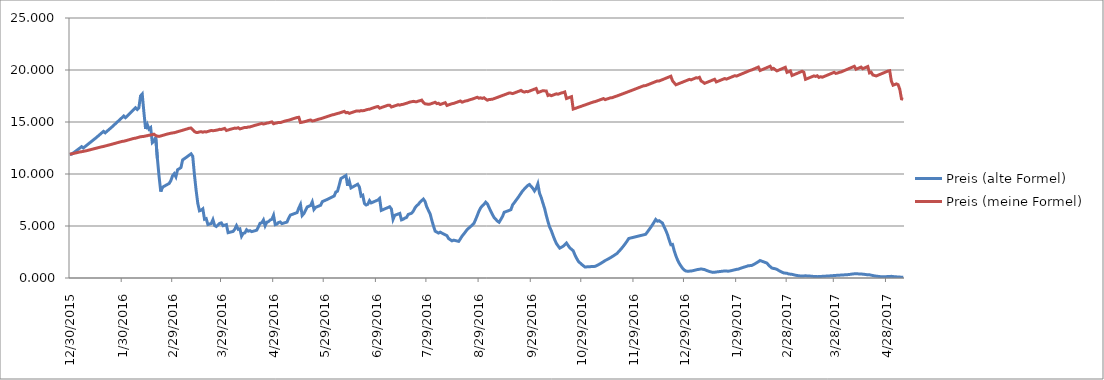
| Category | Preis (alte Formel) | Preis (meine Formel) |
|---|---|---|
| 12/30/15 | 11.9 | 11.9 |
| 12/31/15 | 11.9 | 11.941 |
| 1/1/16 | 12.02 | 11.966 |
| 1/2/16 | 12.14 | 12.006 |
| 1/3/16 | 12.26 | 12.045 |
| 1/4/16 | 12.38 | 12.086 |
| 1/5/16 | 12.5 | 12.122 |
| 1/6/16 | 12.63 | 12.145 |
| 1/7/16 | 12.5 | 12.176 |
| 1/8/16 | 12.63 | 12.211 |
| 1/9/16 | 12.76 | 12.243 |
| 1/10/16 | 12.89 | 12.285 |
| 1/11/16 | 13.02 | 12.327 |
| 1/12/16 | 13.15 | 12.37 |
| 1/13/16 | 13.28 | 12.412 |
| 1/14/16 | 13.41 | 12.455 |
| 1/15/16 | 13.54 | 12.495 |
| 1/16/16 | 13.68 | 12.538 |
| 1/17/16 | 13.82 | 12.581 |
| 1/18/16 | 13.96 | 12.615 |
| 1/19/16 | 14.1 | 12.648 |
| 1/20/16 | 13.96 | 12.692 |
| 1/21/16 | 14.1 | 12.735 |
| 1/22/16 | 14.24 | 12.777 |
| 1/23/16 | 14.38 | 12.821 |
| 1/24/16 | 14.52 | 12.865 |
| 1/25/16 | 14.67 | 12.909 |
| 1/26/16 | 14.82 | 12.954 |
| 1/27/16 | 14.97 | 12.998 |
| 1/28/16 | 15.12 | 13.043 |
| 1/29/16 | 15.27 | 13.088 |
| 1/30/16 | 15.42 | 13.133 |
| 1/31/16 | 15.57 | 13.151 |
| 2/1/16 | 15.41 | 13.193 |
| 2/2/16 | 15.56 | 13.239 |
| 2/3/16 | 15.72 | 13.285 |
| 2/4/16 | 15.88 | 13.33 |
| 2/5/16 | 16.04 | 13.376 |
| 2/6/16 | 16.2 | 13.422 |
| 2/7/16 | 16.36 | 13.444 |
| 2/8/16 | 16.2 | 13.49 |
| 2/9/16 | 16.36 | 13.536 |
| 2/10/16 | 17.51 | 13.583 |
| 2/11/16 | 17.69 | 13.6 |
| 2/12/16 | 15.92 | 13.617 |
| 2/13/16 | 14.33 | 13.656 |
| 2/14/16 | 14.76 | 13.683 |
| 2/15/16 | 14.32 | 13.73 |
| 2/16/16 | 14.46 | 13.743 |
| 2/17/16 | 13.01 | 13.79 |
| 2/18/16 | 13.14 | 13.827 |
| 2/19/16 | 13.53 | 13.696 |
| 2/20/16 | 11.5 | 13.642 |
| 2/21/16 | 9.78 | 13.616 |
| 2/22/16 | 8.31 | 13.658 |
| 2/23/16 | 8.73 | 13.705 |
| 2/24/16 | 8.82 | 13.752 |
| 2/25/16 | 8.91 | 13.8 |
| 2/26/16 | 9 | 13.847 |
| 2/27/16 | 9.09 | 13.884 |
| 2/28/16 | 9.36 | 13.922 |
| 2/29/16 | 9.83 | 13.951 |
| 3/1/16 | 10.03 | 13.969 |
| 3/2/16 | 9.73 | 14.017 |
| 3/3/16 | 10.41 | 14.065 |
| 3/4/16 | 10.51 | 14.114 |
| 3/5/16 | 10.62 | 14.157 |
| 3/6/16 | 11.36 | 14.206 |
| 3/7/16 | 11.47 | 14.255 |
| 3/8/16 | 11.58 | 14.304 |
| 3/9/16 | 11.7 | 14.354 |
| 3/10/16 | 11.82 | 14.403 |
| 3/11/16 | 11.94 | 14.422 |
| 3/12/16 | 11.7 | 14.256 |
| 3/13/16 | 9.94 | 14.081 |
| 3/14/16 | 8.45 | 14.002 |
| 3/15/16 | 7.18 | 13.997 |
| 3/16/16 | 6.46 | 14.045 |
| 3/17/16 | 6.52 | 14.068 |
| 3/18/16 | 6.65 | 14.019 |
| 3/19/16 | 5.65 | 14.068 |
| 3/20/16 | 5.71 | 14.043 |
| 3/21/16 | 5.14 | 14.091 |
| 3/22/16 | 5.19 | 14.14 |
| 3/23/16 | 5.24 | 14.186 |
| 3/24/16 | 5.61 | 14.162 |
| 3/25/16 | 5.05 | 14.179 |
| 3/26/16 | 4.95 | 14.211 |
| 3/27/16 | 5.1 | 14.244 |
| 3/28/16 | 5.25 | 14.293 |
| 3/29/16 | 5.3 | 14.286 |
| 3/30/16 | 5.03 | 14.335 |
| 3/31/16 | 5.08 | 14.384 |
| 4/1/16 | 5.13 | 14.183 |
| 4/2/16 | 4.36 | 14.232 |
| 4/3/16 | 4.4 | 14.281 |
| 4/4/16 | 4.44 | 14.331 |
| 4/5/16 | 4.48 | 14.367 |
| 4/6/16 | 4.7 | 14.413 |
| 4/7/16 | 5.03 | 14.4 |
| 4/8/16 | 4.68 | 14.45 |
| 4/9/16 | 4.73 | 14.338 |
| 4/10/16 | 4.02 | 14.384 |
| 4/11/16 | 4.3 | 14.433 |
| 4/12/16 | 4.34 | 14.48 |
| 4/13/16 | 4.64 | 14.474 |
| 4/14/16 | 4.5 | 14.524 |
| 4/15/16 | 4.55 | 14.53 |
| 4/16/16 | 4.46 | 14.58 |
| 4/17/16 | 4.5 | 14.63 |
| 4/18/16 | 4.55 | 14.68 |
| 4/19/16 | 4.6 | 14.723 |
| 4/20/16 | 4.92 | 14.769 |
| 4/21/16 | 5.26 | 14.82 |
| 4/22/16 | 5.31 | 14.858 |
| 4/23/16 | 5.58 | 14.803 |
| 4/24/16 | 5.02 | 14.843 |
| 4/25/16 | 5.37 | 14.894 |
| 4/26/16 | 5.42 | 14.916 |
| 4/27/16 | 5.58 | 14.967 |
| 4/28/16 | 5.64 | 15.01 |
| 4/29/16 | 6.03 | 14.833 |
| 4/30/16 | 5.13 | 14.884 |
| 5/1/16 | 5.18 | 14.91 |
| 5/2/16 | 5.34 | 14.961 |
| 5/3/16 | 5.39 | 14.943 |
| 5/4/16 | 5.23 | 14.995 |
| 5/5/16 | 5.28 | 15.047 |
| 5/6/16 | 5.33 | 15.099 |
| 5/7/16 | 5.38 | 15.138 |
| 5/8/16 | 5.76 | 15.172 |
| 5/9/16 | 6.05 | 15.224 |
| 5/10/16 | 6.11 | 15.276 |
| 5/11/16 | 6.17 | 15.329 |
| 5/12/16 | 6.23 | 15.382 |
| 5/13/16 | 6.29 | 15.428 |
| 5/14/16 | 6.73 | 15.453 |
| 5/15/16 | 7.07 | 14.95 |
| 5/16/16 | 6.01 | 14.977 |
| 5/17/16 | 6.19 | 15.016 |
| 5/18/16 | 6.5 | 15.053 |
| 5/19/16 | 6.83 | 15.105 |
| 5/20/16 | 6.9 | 15.157 |
| 5/21/16 | 6.97 | 15.195 |
| 5/22/16 | 7.32 | 15.1 |
| 5/23/16 | 6.59 | 15.123 |
| 5/24/16 | 6.79 | 15.175 |
| 5/25/16 | 6.86 | 15.228 |
| 5/26/16 | 6.93 | 15.28 |
| 5/27/16 | 7 | 15.316 |
| 5/28/16 | 7.35 | 15.369 |
| 5/29/16 | 7.42 | 15.422 |
| 5/30/16 | 7.49 | 15.475 |
| 5/31/16 | 7.56 | 15.529 |
| 6/1/16 | 7.64 | 15.582 |
| 6/2/16 | 7.72 | 15.636 |
| 6/3/16 | 7.8 | 15.69 |
| 6/4/16 | 7.88 | 15.719 |
| 6/5/16 | 8.27 | 15.773 |
| 6/6/16 | 8.35 | 15.822 |
| 6/7/16 | 8.93 | 15.858 |
| 6/8/16 | 9.56 | 15.913 |
| 6/9/16 | 9.66 | 15.967 |
| 6/10/16 | 9.76 | 16.022 |
| 6/11/16 | 9.86 | 15.89 |
| 6/12/16 | 8.87 | 15.922 |
| 6/13/16 | 9.31 | 15.83 |
| 6/14/16 | 8.66 | 15.885 |
| 6/15/16 | 8.75 | 15.939 |
| 6/16/16 | 8.84 | 15.994 |
| 6/17/16 | 8.93 | 16.05 |
| 6/18/16 | 9.02 | 16.064 |
| 6/19/16 | 8.75 | 16.041 |
| 6/20/16 | 7.88 | 16.097 |
| 6/21/16 | 7.96 | 16.085 |
| 6/22/16 | 7.16 | 16.111 |
| 6/23/16 | 7.02 | 16.167 |
| 6/24/16 | 7.09 | 16.212 |
| 6/25/16 | 7.44 | 16.232 |
| 6/26/16 | 7.22 | 16.288 |
| 6/27/16 | 7.29 | 16.344 |
| 6/28/16 | 7.36 | 16.401 |
| 6/29/16 | 7.43 | 16.457 |
| 6/30/16 | 7.5 | 16.488 |
| 7/1/16 | 7.65 | 16.331 |
| 7/2/16 | 6.5 | 16.387 |
| 7/3/16 | 6.57 | 16.444 |
| 7/4/16 | 6.64 | 16.5 |
| 7/5/16 | 6.71 | 16.557 |
| 7/6/16 | 6.78 | 16.614 |
| 7/7/16 | 6.85 | 16.615 |
| 7/8/16 | 6.64 | 16.443 |
| 7/9/16 | 5.64 | 16.492 |
| 7/10/16 | 6.03 | 16.549 |
| 7/11/16 | 6.09 | 16.606 |
| 7/12/16 | 6.15 | 16.663 |
| 7/13/16 | 6.21 | 16.62 |
| 7/14/16 | 5.59 | 16.678 |
| 7/15/16 | 5.65 | 16.7 |
| 7/16/16 | 5.76 | 16.757 |
| 7/17/16 | 5.82 | 16.8 |
| 7/18/16 | 6.11 | 16.858 |
| 7/19/16 | 6.17 | 16.916 |
| 7/20/16 | 6.23 | 16.945 |
| 7/21/16 | 6.42 | 16.986 |
| 7/22/16 | 6.74 | 16.958 |
| 7/23/16 | 6.94 | 16.949 |
| 7/24/16 | 7.08 | 17.008 |
| 7/25/16 | 7.29 | 17.048 |
| 7/26/16 | 7.44 | 17.107 |
| 7/27/16 | 7.59 | 16.873 |
| 7/28/16 | 7.36 | 16.752 |
| 7/29/16 | 6.84 | 16.724 |
| 7/30/16 | 6.5 | 16.708 |
| 7/31/16 | 6.18 | 16.724 |
| 8/1/16 | 5.56 | 16.781 |
| 8/2/16 | 5 | 16.839 |
| 8/3/16 | 4.5 | 16.897 |
| 8/4/16 | 4.41 | 16.771 |
| 8/5/16 | 4.32 | 16.8 |
| 8/6/16 | 4.41 | 16.684 |
| 8/7/16 | 4.32 | 16.742 |
| 8/8/16 | 4.23 | 16.799 |
| 8/9/16 | 4.15 | 16.857 |
| 8/10/16 | 4.07 | 16.59 |
| 8/11/16 | 3.79 | 16.647 |
| 8/12/16 | 3.68 | 16.705 |
| 8/13/16 | 3.57 | 16.762 |
| 8/14/16 | 3.64 | 16.79 |
| 8/15/16 | 3.6 | 16.848 |
| 8/16/16 | 3.56 | 16.906 |
| 8/17/16 | 3.52 | 16.964 |
| 8/18/16 | 3.77 | 17.022 |
| 8/19/16 | 4.03 | 16.905 |
| 8/20/16 | 4.23 | 16.963 |
| 8/21/16 | 4.44 | 17.021 |
| 8/22/16 | 4.66 | 17.044 |
| 8/23/16 | 4.8 | 17.103 |
| 8/24/16 | 4.94 | 17.162 |
| 8/25/16 | 5.09 | 17.199 |
| 8/26/16 | 5.24 | 17.259 |
| 8/27/16 | 5.61 | 17.318 |
| 8/28/16 | 6 | 17.378 |
| 8/29/16 | 6.42 | 17.287 |
| 8/30/16 | 6.74 | 17.325 |
| 8/31/16 | 6.94 | 17.271 |
| 9/1/16 | 7.08 | 17.331 |
| 9/2/16 | 7.29 | 17.206 |
| 9/3/16 | 7.14 | 17.1 |
| 9/4/16 | 6.78 | 17.159 |
| 9/5/16 | 6.44 | 17.174 |
| 9/6/16 | 6.12 | 17.189 |
| 9/7/16 | 5.81 | 17.249 |
| 9/8/16 | 5.64 | 17.308 |
| 9/9/16 | 5.47 | 17.368 |
| 9/10/16 | 5.36 | 17.428 |
| 9/11/16 | 5.63 | 17.488 |
| 9/12/16 | 5.91 | 17.548 |
| 9/13/16 | 6.32 | 17.609 |
| 9/14/16 | 6.38 | 17.669 |
| 9/15/16 | 6.44 | 17.73 |
| 9/16/16 | 6.5 | 17.791 |
| 9/17/16 | 6.57 | 17.776 |
| 9/18/16 | 7.03 | 17.729 |
| 9/19/16 | 7.24 | 17.79 |
| 9/20/16 | 7.46 | 17.851 |
| 9/21/16 | 7.68 | 17.913 |
| 9/22/16 | 7.91 | 17.975 |
| 9/23/16 | 8.15 | 18.037 |
| 9/24/16 | 8.39 | 17.93 |
| 9/25/16 | 8.56 | 17.873 |
| 9/26/16 | 8.73 | 17.935 |
| 9/27/16 | 8.9 | 17.91 |
| 9/28/16 | 8.99 | 17.972 |
| 9/29/16 | 8.81 | 18.034 |
| 9/30/16 | 8.63 | 18.096 |
| 10/1/16 | 8.37 | 18.158 |
| 10/2/16 | 8.62 | 18.221 |
| 10/3/16 | 9.05 | 17.828 |
| 10/4/16 | 8.15 | 17.89 |
| 10/5/16 | 7.74 | 17.951 |
| 10/6/16 | 7.2 | 18.013 |
| 10/7/16 | 6.7 | 17.993 |
| 10/8/16 | 6.03 | 17.989 |
| 10/9/16 | 5.43 | 17.549 |
| 10/10/16 | 4.89 | 17.609 |
| 10/11/16 | 4.55 | 17.527 |
| 10/12/16 | 4.1 | 17.588 |
| 10/13/16 | 3.69 | 17.648 |
| 10/14/16 | 3.32 | 17.709 |
| 10/15/16 | 3.09 | 17.672 |
| 10/16/16 | 2.87 | 17.733 |
| 10/17/16 | 2.96 | 17.795 |
| 10/18/16 | 3.05 | 17.829 |
| 10/19/16 | 3.2 | 17.891 |
| 10/20/16 | 3.36 | 17.257 |
| 10/21/16 | 3.12 | 17.316 |
| 10/22/16 | 2.9 | 17.376 |
| 10/23/16 | 2.76 | 17.436 |
| 10/24/16 | 2.62 | 16.243 |
| 10/25/16 | 2.23 | 16.299 |
| 10/26/16 | 1.9 | 16.355 |
| 10/27/16 | 1.62 | 16.412 |
| 10/28/16 | 1.46 | 16.468 |
| 10/29/16 | 1.31 | 16.525 |
| 10/30/16 | 1.18 | 16.582 |
| 10/31/16 | 1.06 | 16.639 |
| 11/1/16 | 1.07 | 16.697 |
| 11/2/16 | 1.08 | 16.754 |
| 11/3/16 | 1.09 | 16.812 |
| 11/4/16 | 1.1 | 16.87 |
| 11/5/16 | 1.11 | 16.928 |
| 11/6/16 | 1.12 | 16.96 |
| 11/7/16 | 1.2 | 17.018 |
| 11/8/16 | 1.28 | 17.077 |
| 11/9/16 | 1.37 | 17.136 |
| 11/10/16 | 1.47 | 17.195 |
| 11/11/16 | 1.57 | 17.254 |
| 11/12/16 | 1.68 | 17.151 |
| 11/13/16 | 1.76 | 17.21 |
| 11/14/16 | 1.85 | 17.259 |
| 11/15/16 | 1.94 | 17.318 |
| 11/16/16 | 2.04 | 17.331 |
| 11/17/16 | 2.14 | 17.391 |
| 11/18/16 | 2.25 | 17.451 |
| 11/19/16 | 2.36 | 17.503 |
| 11/20/16 | 2.53 | 17.563 |
| 11/21/16 | 2.71 | 17.624 |
| 11/22/16 | 2.9 | 17.685 |
| 11/23/16 | 3.1 | 17.746 |
| 11/24/16 | 3.32 | 17.807 |
| 11/25/16 | 3.55 | 17.868 |
| 11/26/16 | 3.8 | 17.93 |
| 11/27/16 | 3.84 | 17.992 |
| 11/28/16 | 3.88 | 18.054 |
| 11/29/16 | 3.92 | 18.116 |
| 11/30/16 | 3.96 | 18.179 |
| 12/1/16 | 4 | 18.241 |
| 12/2/16 | 4.04 | 18.304 |
| 12/3/16 | 4.08 | 18.367 |
| 12/4/16 | 4.12 | 18.431 |
| 12/5/16 | 4.16 | 18.494 |
| 12/6/16 | 4.2 | 18.498 |
| 12/7/16 | 4.41 | 18.562 |
| 12/8/16 | 4.63 | 18.626 |
| 12/9/16 | 4.86 | 18.69 |
| 12/10/16 | 5.1 | 18.755 |
| 12/11/16 | 5.36 | 18.819 |
| 12/12/16 | 5.63 | 18.884 |
| 12/13/16 | 5.46 | 18.949 |
| 12/14/16 | 5.51 | 18.941 |
| 12/15/16 | 5.4 | 19.006 |
| 12/16/16 | 5.29 | 19.072 |
| 12/17/16 | 4.92 | 19.138 |
| 12/18/16 | 4.58 | 19.204 |
| 12/19/16 | 4.18 | 19.27 |
| 12/20/16 | 3.66 | 19.336 |
| 12/21/16 | 3.2 | 19.403 |
| 12/22/16 | 3.23 | 18.96 |
| 12/23/16 | 2.62 | 18.767 |
| 12/24/16 | 2.13 | 18.578 |
| 12/25/16 | 1.73 | 18.642 |
| 12/26/16 | 1.41 | 18.706 |
| 12/27/16 | 1.15 | 18.771 |
| 12/28/16 | 0.93 | 18.835 |
| 12/29/16 | 0.76 | 18.9 |
| 12/30/16 | 0.67 | 18.966 |
| 12/31/16 | 0.65 | 19.031 |
| 1/1/17 | 0.66 | 19.097 |
| 1/2/17 | 0.67 | 19.053 |
| 1/3/17 | 0.7 | 19.118 |
| 1/4/17 | 0.74 | 19.184 |
| 1/5/17 | 0.78 | 19.251 |
| 1/6/17 | 0.82 | 19.234 |
| 1/7/17 | 0.84 | 19.3 |
| 1/8/17 | 0.87 | 18.94 |
| 1/9/17 | 0.84 | 18.85 |
| 1/10/17 | 0.81 | 18.717 |
| 1/11/17 | 0.74 | 18.781 |
| 1/12/17 | 0.68 | 18.846 |
| 1/13/17 | 0.62 | 18.911 |
| 1/14/17 | 0.58 | 18.976 |
| 1/15/17 | 0.54 | 19.042 |
| 1/16/17 | 0.55 | 19.107 |
| 1/17/17 | 0.58 | 18.852 |
| 1/18/17 | 0.6 | 18.917 |
| 1/19/17 | 0.62 | 18.983 |
| 1/20/17 | 0.64 | 19.048 |
| 1/21/17 | 0.66 | 19.114 |
| 1/22/17 | 0.67 | 19.18 |
| 1/23/17 | 0.68 | 19.123 |
| 1/24/17 | 0.65 | 19.188 |
| 1/25/17 | 0.68 | 19.255 |
| 1/26/17 | 0.71 | 19.321 |
| 1/27/17 | 0.75 | 19.388 |
| 1/28/17 | 0.79 | 19.454 |
| 1/29/17 | 0.83 | 19.415 |
| 1/30/17 | 0.85 | 19.482 |
| 1/31/17 | 0.91 | 19.549 |
| 2/1/17 | 0.97 | 19.616 |
| 2/2/17 | 1.02 | 19.684 |
| 2/3/17 | 1.07 | 19.752 |
| 2/4/17 | 1.12 | 19.82 |
| 2/5/17 | 1.18 | 19.888 |
| 2/6/17 | 1.19 | 19.957 |
| 2/7/17 | 1.2 | 20.004 |
| 2/8/17 | 1.28 | 20.073 |
| 2/9/17 | 1.37 | 20.142 |
| 2/10/17 | 1.47 | 20.212 |
| 2/11/17 | 1.57 | 20.281 |
| 2/12/17 | 1.68 | 19.947 |
| 2/13/17 | 1.62 | 20.016 |
| 2/14/17 | 1.56 | 20.085 |
| 2/15/17 | 1.5 | 20.154 |
| 2/16/17 | 1.44 | 20.224 |
| 2/17/17 | 1.26 | 20.293 |
| 2/18/17 | 1.1 | 20.363 |
| 2/19/17 | 0.96 | 20.09 |
| 2/20/17 | 0.92 | 20.16 |
| 2/21/17 | 0.89 | 20.031 |
| 2/22/17 | 0.83 | 19.914 |
| 2/23/17 | 0.73 | 19.983 |
| 2/24/17 | 0.64 | 20.051 |
| 2/25/17 | 0.56 | 20.121 |
| 2/26/17 | 0.49 | 20.19 |
| 2/27/17 | 0.47 | 20.26 |
| 2/28/17 | 0.45 | 19.774 |
| 3/1/17 | 0.39 | 19.842 |
| 3/2/17 | 0.37 | 19.911 |
| 3/3/17 | 0.35 | 19.473 |
| 3/4/17 | 0.31 | 19.541 |
| 3/5/17 | 0.27 | 19.608 |
| 3/6/17 | 0.24 | 19.676 |
| 3/7/17 | 0.21 | 19.743 |
| 3/8/17 | 0.2 | 19.811 |
| 3/9/17 | 0.2 | 19.88 |
| 3/10/17 | 0.2 | 19.786 |
| 3/11/17 | 0.21 | 19.104 |
| 3/12/17 | 0.2 | 19.169 |
| 3/13/17 | 0.19 | 19.236 |
| 3/14/17 | 0.18 | 19.3 |
| 3/15/17 | 0.16 | 19.367 |
| 3/16/17 | 0.15 | 19.433 |
| 3/17/17 | 0.14 | 19.381 |
| 3/18/17 | 0.13 | 19.448 |
| 3/19/17 | 0.14 | 19.288 |
| 3/20/17 | 0.15 | 19.354 |
| 3/21/17 | 0.16 | 19.307 |
| 3/22/17 | 0.17 | 19.374 |
| 3/23/17 | 0.18 | 19.44 |
| 3/24/17 | 0.19 | 19.507 |
| 3/25/17 | 0.2 | 19.575 |
| 3/26/17 | 0.21 | 19.642 |
| 3/27/17 | 0.22 | 19.71 |
| 3/28/17 | 0.24 | 19.778 |
| 3/29/17 | 0.25 | 19.673 |
| 3/30/17 | 0.26 | 19.706 |
| 3/31/17 | 0.27 | 19.774 |
| 4/1/17 | 0.28 | 19.805 |
| 4/2/17 | 0.29 | 19.873 |
| 4/3/17 | 0.3 | 19.941 |
| 4/4/17 | 0.31 | 20.01 |
| 4/5/17 | 0.32 | 20.079 |
| 4/6/17 | 0.34 | 20.148 |
| 4/7/17 | 0.36 | 20.218 |
| 4/8/17 | 0.39 | 20.288 |
| 4/9/17 | 0.4 | 20.358 |
| 4/10/17 | 0.41 | 20.073 |
| 4/11/17 | 0.4 | 20.142 |
| 4/12/17 | 0.39 | 20.211 |
| 4/13/17 | 0.38 | 20.281 |
| 4/14/17 | 0.37 | 20.125 |
| 4/15/17 | 0.35 | 20.194 |
| 4/16/17 | 0.33 | 20.264 |
| 4/17/17 | 0.3 | 20.334 |
| 4/18/17 | 0.31 | 19.721 |
| 4/19/17 | 0.27 | 19.789 |
| 4/20/17 | 0.24 | 19.522 |
| 4/21/17 | 0.2 | 19.474 |
| 4/22/17 | 0.18 | 19.428 |
| 4/23/17 | 0.16 | 19.495 |
| 4/24/17 | 0.14 | 19.562 |
| 4/25/17 | 0.12 | 19.63 |
| 4/26/17 | 0.12 | 19.697 |
| 4/27/17 | 0.12 | 19.765 |
| 4/28/17 | 0.13 | 19.834 |
| 4/29/17 | 0.14 | 19.9 |
| 4/30/17 | 0.15 | 19.932 |
| 5/1/17 | 0.16 | 18.931 |
| 5/2/17 | 0.14 | 18.537 |
| 5/3/17 | 0.12 | 18.601 |
| 5/4/17 | 0.11 | 18.665 |
| 5/5/17 | 0.1 | 18.59 |
| 5/6/17 | 0.09 | 18.143 |
| 5/7/17 | 0.07 | 17.228 |
| 5/8/17 | 0.06 | 17.181 |